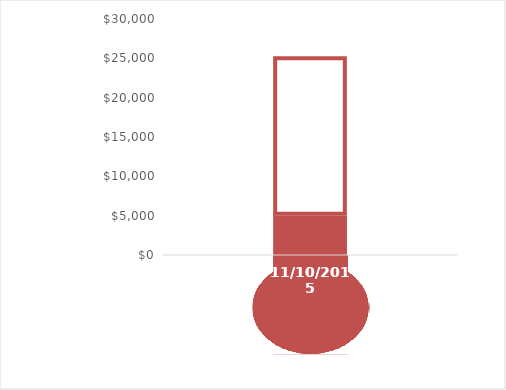
| Category | Series 0 | Series 1 | Series 2 |
|---|---|---|---|
| 11/10/15 | 5000 | 20000 | 0 |